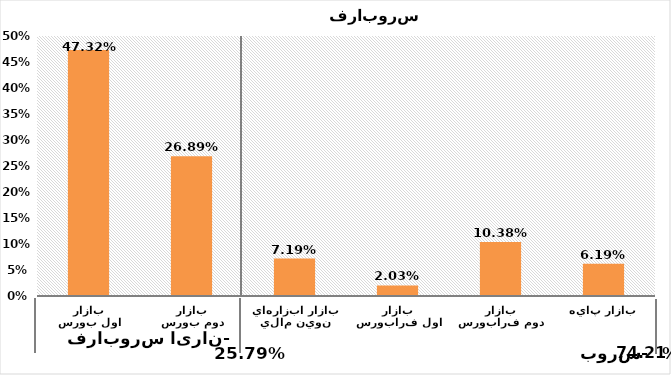
| Category | Series 0 |
|---|---|
| بازار اول بورس | 0.473 |
| بازار دوم بورس | 0.269 |
| بازار ابزارهاي نوين مالي | 0.072 |
| بازار اول فرابورس | 0.02 |
| بازار دوم فرابورس | 0.104 |
| بازار پايه | 0.062 |